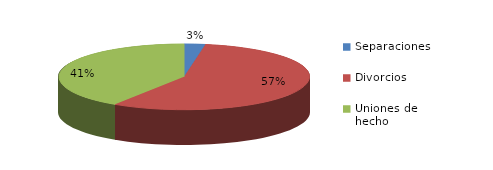
| Category | Series 0 |
|---|---|
| Separaciones | 20 |
| Divorcios | 417 |
| Uniones de hecho | 301 |